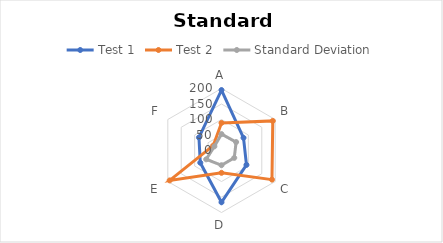
| Category | Test 1 | Test 2 | Standard Deviation |
|---|---|---|---|
| A | 195 | 89 | 53 |
| B | 82 | 191 | 54.5 |
| C | 93 | 188 | 47.5 |
| D | 167 | 72 | 47.5 |
| E | 79 | 193 | 57 |
| F | 84 | 31 | 26.5 |